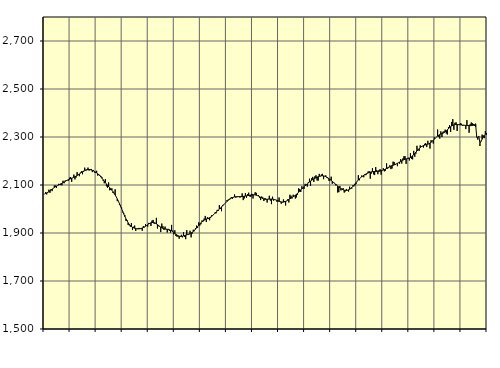
| Category | Piggar | Series 1 |
|---|---|---|
| nan | 2063 | 2062.18 |
| 87.0 | 2070 | 2064.55 |
| 87.0 | 2060.8 | 2067.05 |
| 87.0 | 2067.5 | 2069.86 |
| 87.0 | 2080.4 | 2072.81 |
| 87.0 | 2067.6 | 2075.93 |
| 87.0 | 2083.3 | 2079.33 |
| 87.0 | 2074.5 | 2082.72 |
| 87.0 | 2086.3 | 2086.15 |
| 87.0 | 2097.8 | 2089.41 |
| 87.0 | 2097.9 | 2092.45 |
| 87.0 | 2088.3 | 2095.26 |
| nan | 2098.3 | 2097.83 |
| 88.0 | 2104.9 | 2100.18 |
| 88.0 | 2104.1 | 2102.49 |
| 88.0 | 2099.5 | 2104.87 |
| 88.0 | 2098.8 | 2107.28 |
| 88.0 | 2117.9 | 2109.79 |
| 88.0 | 2107.3 | 2112.44 |
| 88.0 | 2118.6 | 2115.07 |
| 88.0 | 2119.4 | 2117.6 |
| 88.0 | 2121.1 | 2119.96 |
| 88.0 | 2117.8 | 2122.13 |
| 88.0 | 2130.4 | 2124.12 |
| nan | 2133.1 | 2126.08 |
| 89.0 | 2113.1 | 2128.04 |
| 89.0 | 2130.3 | 2130.01 |
| 89.0 | 2143.3 | 2132.13 |
| 89.0 | 2123.2 | 2134.48 |
| 89.0 | 2131 | 2137.04 |
| 89.0 | 2153.7 | 2139.81 |
| 89.0 | 2143.8 | 2142.78 |
| 89.0 | 2136.7 | 2145.88 |
| 89.0 | 2151.7 | 2149.06 |
| 89.0 | 2157.7 | 2152.25 |
| 89.0 | 2144.7 | 2155.31 |
| nan | 2154.7 | 2158.13 |
| 90.0 | 2172.3 | 2160.58 |
| 90.0 | 2160 | 2162.59 |
| 90.0 | 2161.7 | 2163.98 |
| 90.0 | 2172.5 | 2164.69 |
| 90.0 | 2160 | 2164.73 |
| 90.0 | 2166 | 2164.04 |
| 90.0 | 2166.9 | 2162.71 |
| 90.0 | 2153.9 | 2160.95 |
| 90.0 | 2162.6 | 2158.79 |
| 90.0 | 2151.9 | 2156.27 |
| 90.0 | 2149.9 | 2153.49 |
| nan | 2159.3 | 2150.34 |
| 91.0 | 2139.1 | 2146.76 |
| 91.0 | 2145.1 | 2142.69 |
| 91.0 | 2140.5 | 2138.13 |
| 91.0 | 2136.3 | 2133.1 |
| 91.0 | 2131.8 | 2127.69 |
| 91.0 | 2117.2 | 2121.93 |
| 91.0 | 2107.3 | 2115.95 |
| 91.0 | 2124.5 | 2109.99 |
| 91.0 | 2094.5 | 2104.27 |
| 91.0 | 2088.6 | 2098.85 |
| 91.0 | 2110.7 | 2093.71 |
| nan | 2078 | 2088.67 |
| 92.0 | 2079.7 | 2083.58 |
| 92.0 | 2086.2 | 2078.25 |
| 92.0 | 2067.1 | 2072.41 |
| 92.0 | 2066.7 | 2065.94 |
| 92.0 | 2081.9 | 2058.7 |
| 92.0 | 2051.1 | 2050.71 |
| 92.0 | 2032.7 | 2041.98 |
| 92.0 | 2032.9 | 2032.53 |
| 92.0 | 2017.8 | 2022.33 |
| 92.0 | 2015.4 | 2011.67 |
| 92.0 | 2005.8 | 2000.68 |
| nan | 1985.7 | 1989.55 |
| 93.0 | 1982 | 1978.7 |
| 93.0 | 1974.2 | 1968.39 |
| 93.0 | 1950.8 | 1958.83 |
| 93.0 | 1953.6 | 1950.21 |
| 93.0 | 1933.8 | 1942.61 |
| 93.0 | 1931.6 | 1936.11 |
| 93.0 | 1926.6 | 1930.9 |
| 93.0 | 1941.5 | 1926.89 |
| 93.0 | 1912.3 | 1923.85 |
| 93.0 | 1925.9 | 1921.56 |
| 93.0 | 1931 | 1919.8 |
| nan | 1908.4 | 1918.53 |
| 94.0 | 1917.3 | 1917.68 |
| 94.0 | 1919.1 | 1917.23 |
| 94.0 | 1921.2 | 1917.31 |
| 94.0 | 1918.4 | 1917.95 |
| 94.0 | 1916.5 | 1919.09 |
| 94.0 | 1909.2 | 1920.78 |
| 94.0 | 1928.8 | 1922.95 |
| 94.0 | 1923.4 | 1925.42 |
| 94.0 | 1937.1 | 1928.19 |
| 94.0 | 1932.1 | 1931.26 |
| 94.0 | 1926.2 | 1934.4 |
| nan | 1942.2 | 1937.52 |
| 95.0 | 1939.2 | 1940.36 |
| 95.0 | 1929.1 | 1942.5 |
| 95.0 | 1951.7 | 1943.7 |
| 95.0 | 1954.4 | 1943.8 |
| 95.0 | 1938.1 | 1942.79 |
| 95.0 | 1942.3 | 1940.88 |
| 95.0 | 1963.2 | 1938.2 |
| 95.0 | 1918.8 | 1934.95 |
| 95.0 | 1928.1 | 1931.44 |
| 95.0 | 1929.3 | 1927.83 |
| 95.0 | 1903.9 | 1924.42 |
| nan | 1939.2 | 1921.5 |
| 96.0 | 1928.5 | 1919.18 |
| 96.0 | 1913 | 1917.56 |
| 96.0 | 1926.8 | 1916.56 |
| 96.0 | 1917 | 1915.9 |
| 96.0 | 1902.2 | 1915.36 |
| 96.0 | 1917.3 | 1914.63 |
| 96.0 | 1908.7 | 1913.35 |
| 96.0 | 1901.8 | 1911.39 |
| 96.0 | 1933.7 | 1908.78 |
| 96.0 | 1910.2 | 1905.59 |
| 96.0 | 1894.5 | 1902.1 |
| nan | 1911.5 | 1898.43 |
| 97.0 | 1887.5 | 1894.73 |
| 97.0 | 1884.7 | 1891.33 |
| 97.0 | 1885 | 1888.5 |
| 97.0 | 1876.2 | 1886.56 |
| 97.0 | 1887.6 | 1885.71 |
| 97.0 | 1892.4 | 1885.87 |
| 97.0 | 1881.9 | 1886.78 |
| 97.0 | 1903.2 | 1888.16 |
| 97.0 | 1884 | 1889.68 |
| 97.0 | 1874.4 | 1891.14 |
| 97.0 | 1912 | 1892.53 |
| nan | 1893.7 | 1893.93 |
| 98.0 | 1893.3 | 1895.5 |
| 98.0 | 1909.4 | 1897.47 |
| 98.0 | 1881.8 | 1899.99 |
| 98.0 | 1897.4 | 1903.1 |
| 98.0 | 1913.7 | 1906.78 |
| 98.0 | 1907.6 | 1911.04 |
| 98.0 | 1920.7 | 1915.82 |
| 98.0 | 1930.8 | 1921.06 |
| 98.0 | 1921.1 | 1926.62 |
| 98.0 | 1944.5 | 1932.34 |
| 98.0 | 1930.9 | 1937.84 |
| nan | 1936.5 | 1942.76 |
| 99.0 | 1952.3 | 1947.03 |
| 99.0 | 1947.9 | 1950.58 |
| 99.0 | 1960.2 | 1953.49 |
| 99.0 | 1971.1 | 1955.93 |
| 99.0 | 1945.7 | 1957.99 |
| 99.0 | 1965.8 | 1959.78 |
| 99.0 | 1958.2 | 1961.6 |
| 99.0 | 1953.1 | 1963.8 |
| 99.0 | 1963.9 | 1966.54 |
| 99.0 | 1974.3 | 1969.86 |
| 99.0 | 1973.5 | 1973.69 |
| nan | 1977.5 | 1977.98 |
| 0.0 | 1985.5 | 1982.48 |
| 0.0 | 1982 | 1986.97 |
| 0.0 | 1996.4 | 1991.38 |
| 0.0 | 1992.7 | 1995.65 |
| 0.0 | 2016.3 | 1999.85 |
| 0.0 | 2000.2 | 2004.12 |
| 0.0 | 1990.7 | 2008.52 |
| 0.0 | 2016.8 | 2013.06 |
| 0.0 | 2016.6 | 2017.75 |
| 0.0 | 2022.4 | 2022.49 |
| 0.0 | 2028.5 | 2027.18 |
| nan | 2036.8 | 2031.72 |
| 1.0 | 2038.6 | 2035.99 |
| 1.0 | 2037.4 | 2039.83 |
| 1.0 | 2040.8 | 2043.07 |
| 1.0 | 2049.7 | 2045.69 |
| 1.0 | 2042.3 | 2047.76 |
| 1.0 | 2048.5 | 2049.25 |
| 1.0 | 2060.7 | 2050.35 |
| 1.0 | 2047.5 | 2051.09 |
| 1.0 | 2049 | 2051.42 |
| 1.0 | 2053.1 | 2051.48 |
| 1.0 | 2052.1 | 2051.46 |
| nan | 2047.5 | 2051.45 |
| 2.0 | 2052.2 | 2051.62 |
| 2.0 | 2065.1 | 2052.04 |
| 2.0 | 2037 | 2052.64 |
| 2.0 | 2044.1 | 2053.32 |
| 2.0 | 2066.4 | 2054.04 |
| 2.0 | 2046.9 | 2054.81 |
| 2.0 | 2062.5 | 2055.61 |
| 2.0 | 2068 | 2056.5 |
| 2.0 | 2052.3 | 2057.43 |
| 2.0 | 2051 | 2058.25 |
| 2.0 | 2063.1 | 2058.88 |
| nan | 2043.7 | 2059.19 |
| 3.0 | 2058.7 | 2059.07 |
| 3.0 | 2069.9 | 2058.52 |
| 3.0 | 2067.3 | 2057.5 |
| 3.0 | 2055.3 | 2055.99 |
| 3.0 | 2058.3 | 2053.96 |
| 3.0 | 2046.8 | 2051.49 |
| 3.0 | 2037.2 | 2048.76 |
| 3.0 | 2052 | 2046.02 |
| 3.0 | 2048.5 | 2043.6 |
| 3.0 | 2033.2 | 2041.8 |
| 3.0 | 2045.9 | 2040.76 |
| nan | 2039.3 | 2040.44 |
| 4.0 | 2027 | 2040.62 |
| 4.0 | 2041.8 | 2040.98 |
| 4.0 | 2055.1 | 2041.34 |
| 4.0 | 2034.8 | 2041.58 |
| 4.0 | 2020.2 | 2041.52 |
| 4.0 | 2051.3 | 2041.08 |
| 4.0 | 2034.6 | 2040.34 |
| 4.0 | 2039.8 | 2039.27 |
| 4.0 | 2037.7 | 2037.81 |
| 4.0 | 2030.5 | 2036.15 |
| 4.0 | 2030.7 | 2034.34 |
| nan | 2047.9 | 2032.48 |
| 5.0 | 2028.8 | 2030.84 |
| 5.0 | 2022 | 2029.6 |
| 5.0 | 2027.3 | 2028.88 |
| 5.0 | 2040 | 2028.9 |
| 5.0 | 2033.4 | 2029.84 |
| 5.0 | 2014.7 | 2031.59 |
| 5.0 | 2032.9 | 2033.9 |
| 5.0 | 2040.3 | 2036.56 |
| 5.0 | 2027.2 | 2039.42 |
| 5.0 | 2059.2 | 2042.33 |
| 5.0 | 2055.2 | 2045.23 |
| nan | 2044.2 | 2048.14 |
| 6.0 | 2059.5 | 2051.05 |
| 6.0 | 2053.4 | 2054.14 |
| 6.0 | 2043.4 | 2057.54 |
| 6.0 | 2048.5 | 2061.24 |
| 6.0 | 2059.4 | 2065.22 |
| 6.0 | 2086.1 | 2069.63 |
| 6.0 | 2083.1 | 2074.38 |
| 6.0 | 2070.9 | 2079.18 |
| 6.0 | 2094.7 | 2083.94 |
| 6.0 | 2085.2 | 2088.51 |
| 6.0 | 2083.6 | 2092.68 |
| nan | 2104.8 | 2096.64 |
| 7.0 | 2099.2 | 2100.58 |
| 7.0 | 2093.2 | 2104.52 |
| 7.0 | 2112.4 | 2108.52 |
| 7.0 | 2126.2 | 2112.5 |
| 7.0 | 2096.7 | 2116.29 |
| 7.0 | 2127.7 | 2119.74 |
| 7.0 | 2133.8 | 2122.79 |
| 7.0 | 2113 | 2125.54 |
| 7.0 | 2136.2 | 2128.05 |
| 7.0 | 2140.6 | 2130.34 |
| 7.0 | 2119.2 | 2132.52 |
| nan | 2118.1 | 2134.53 |
| 8.0 | 2146.4 | 2136.17 |
| 8.0 | 2135.9 | 2137.45 |
| 8.0 | 2143.9 | 2138.26 |
| 8.0 | 2146.6 | 2138.46 |
| 8.0 | 2124.2 | 2137.99 |
| 8.0 | 2135.9 | 2136.86 |
| 8.0 | 2140 | 2134.99 |
| 8.0 | 2129.7 | 2132.47 |
| 8.0 | 2128.2 | 2129.44 |
| 8.0 | 2117.1 | 2126.01 |
| 8.0 | 2124.1 | 2122.39 |
| nan | 2134.6 | 2118.72 |
| 9.0 | 2105.1 | 2115.04 |
| 9.0 | 2110.1 | 2111.28 |
| 9.0 | 2108.9 | 2107.44 |
| 9.0 | 2098.7 | 2103.49 |
| 9.0 | 2101.5 | 2099.52 |
| 9.0 | 2068.7 | 2095.58 |
| 9.0 | 2070.4 | 2091.71 |
| 9.0 | 2095.9 | 2088.07 |
| 9.0 | 2077.5 | 2084.79 |
| 9.0 | 2084.4 | 2082.01 |
| 9.0 | 2087 | 2079.86 |
| nan | 2068.3 | 2078.36 |
| 10.0 | 2073.2 | 2077.59 |
| 10.0 | 2083.4 | 2077.57 |
| 10.0 | 2077.2 | 2078.31 |
| 10.0 | 2072.8 | 2079.86 |
| 10.0 | 2093 | 2082.23 |
| 10.0 | 2083.8 | 2085.42 |
| 10.0 | 2085 | 2089.42 |
| 10.0 | 2098.9 | 2094.09 |
| 10.0 | 2094.8 | 2099.27 |
| 10.0 | 2099.3 | 2104.78 |
| 10.0 | 2105.2 | 2110.36 |
| nan | 2117 | 2115.79 |
| 11.0 | 2140.7 | 2120.96 |
| 11.0 | 2119.7 | 2125.77 |
| 11.0 | 2129.5 | 2130.07 |
| 11.0 | 2139.3 | 2133.94 |
| 11.0 | 2136 | 2137.47 |
| 11.0 | 2132.3 | 2140.57 |
| 11.0 | 2145.5 | 2143.32 |
| 11.0 | 2140.9 | 2145.82 |
| 11.0 | 2147.4 | 2148.1 |
| 11.0 | 2156 | 2150.16 |
| 11.0 | 2157.6 | 2152.04 |
| nan | 2126.4 | 2153.64 |
| 12.0 | 2147.7 | 2154.81 |
| 12.0 | 2169.8 | 2155.56 |
| 12.0 | 2144.4 | 2156.07 |
| 12.0 | 2141.5 | 2156.25 |
| 12.0 | 2174.7 | 2156.25 |
| 12.0 | 2161.9 | 2156.29 |
| 12.0 | 2145 | 2156.51 |
| 12.0 | 2161.6 | 2157.04 |
| 12.0 | 2166.1 | 2158.02 |
| 12.0 | 2143.2 | 2159.3 |
| 12.0 | 2160.4 | 2160.78 |
| nan | 2169.8 | 2162.46 |
| 13.0 | 2156.9 | 2164.38 |
| 13.0 | 2159.7 | 2166.58 |
| 13.0 | 2190.1 | 2168.99 |
| 13.0 | 2167.8 | 2171.59 |
| 13.0 | 2171.3 | 2174.12 |
| 13.0 | 2181.9 | 2176.44 |
| 13.0 | 2166.1 | 2178.55 |
| 13.0 | 2168.8 | 2180.43 |
| 13.0 | 2197.4 | 2182.05 |
| 13.0 | 2195.9 | 2183.73 |
| 13.0 | 2183.3 | 2185.68 |
| nan | 2188.6 | 2187.88 |
| 14.0 | 2178.4 | 2190.38 |
| 14.0 | 2192.3 | 2193.05 |
| 14.0 | 2188.7 | 2195.76 |
| 14.0 | 2207.9 | 2198.44 |
| 14.0 | 2189.6 | 2201.01 |
| 14.0 | 2210.4 | 2203.39 |
| 14.0 | 2219.9 | 2205.54 |
| 14.0 | 2220.1 | 2207.32 |
| 14.0 | 2187.9 | 2208.68 |
| 14.0 | 2209.7 | 2209.76 |
| 14.0 | 2213.6 | 2210.86 |
| nan | 2202 | 2212.34 |
| 15.0 | 2232.3 | 2214.49 |
| 15.0 | 2209 | 2217.55 |
| 15.0 | 2206.8 | 2221.47 |
| 15.0 | 2242.1 | 2226.13 |
| 15.0 | 2217.6 | 2231.32 |
| 15.0 | 2230.1 | 2236.74 |
| 15.0 | 2263.3 | 2242.03 |
| 15.0 | 2244.9 | 2247.1 |
| 15.0 | 2242.3 | 2251.79 |
| 15.0 | 2265.4 | 2255.98 |
| 15.0 | 2262.3 | 2259.51 |
| nan | 2261.2 | 2262.3 |
| 16.0 | 2256 | 2264.4 |
| 16.0 | 2271.4 | 2265.95 |
| 16.0 | 2274.4 | 2267.16 |
| 16.0 | 2258.2 | 2268.32 |
| 16.0 | 2284.1 | 2269.82 |
| 16.0 | 2272 | 2271.9 |
| 16.0 | 2251.8 | 2274.68 |
| 16.0 | 2286.9 | 2278.11 |
| 16.0 | 2282.5 | 2282.14 |
| 16.0 | 2272.8 | 2286.54 |
| 16.0 | 2298.4 | 2291.09 |
| nan | 2296 | 2295.71 |
| 17.0 | 2299.7 | 2300.13 |
| 17.0 | 2330.9 | 2304.02 |
| 17.0 | 2300.5 | 2307.33 |
| 17.0 | 2293.3 | 2310 |
| 17.0 | 2323.5 | 2312.09 |
| 17.0 | 2299.9 | 2313.96 |
| 17.0 | 2321.7 | 2316.01 |
| 17.0 | 2324.1 | 2318.52 |
| 17.0 | 2330.7 | 2321.69 |
| 17.0 | 2314.6 | 2325.59 |
| 17.0 | 2310.5 | 2330.03 |
| nan | 2341.5 | 2334.6 |
| 18.0 | 2350 | 2338.95 |
| 18.0 | 2321 | 2342.8 |
| 18.0 | 2362.6 | 2345.98 |
| 18.0 | 2374.3 | 2348.53 |
| 18.0 | 2329.9 | 2350.45 |
| 18.0 | 2359.3 | 2351.55 |
| 18.0 | 2361.2 | 2351.95 |
| 18.0 | 2325 | 2351.89 |
| 18.0 | 2353.6 | 2351.55 |
| 18.0 | 2352 | 2351.07 |
| 18.0 | 2357.4 | 2350.56 |
| nan | 2355.4 | 2350.03 |
| 19.0 | 2346.3 | 2349.47 |
| 19.0 | 2350.4 | 2349.01 |
| 19.0 | 2349.1 | 2348.66 |
| 19.0 | 2332.9 | 2348.28 |
| 19.0 | 2370.4 | 2347.88 |
| 19.0 | 2348.7 | 2347.62 |
| 19.0 | 2317.6 | 2347.43 |
| 19.0 | 2353.6 | 2347.33 |
| 19.0 | 2360.5 | 2347.47 |
| 19.0 | 2357.7 | 2348.02 |
| 19.0 | 2354.4 | 2349.19 |
| nan | 2345.8 | 2351.31 |
| 20.0 | 2342.3 | 2354.71 |
| 20.0 | 2298.3 | 2302.24 |
| 20.0 | 2289.2 | 2295.84 |
| 20.0 | 2304.3 | 2303.13 |
| 20.0 | 2262.6 | 2273.67 |
| 20.0 | 2284.5 | 2282.16 |
| 20.0 | 2310 | 2290.71 |
| 20.0 | 2306.4 | 2298.81 |
| 20.0 | 2295.2 | 2305.92 |
| 20.0 | 2325.1 | 2311.82 |
| 20.0 | 2309.9 | 2316.6 |